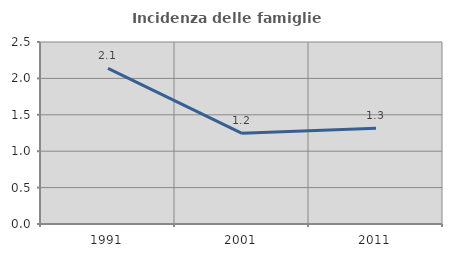
| Category | Incidenza delle famiglie numerose |
|---|---|
| 1991.0 | 2.137 |
| 2001.0 | 1.245 |
| 2011.0 | 1.314 |